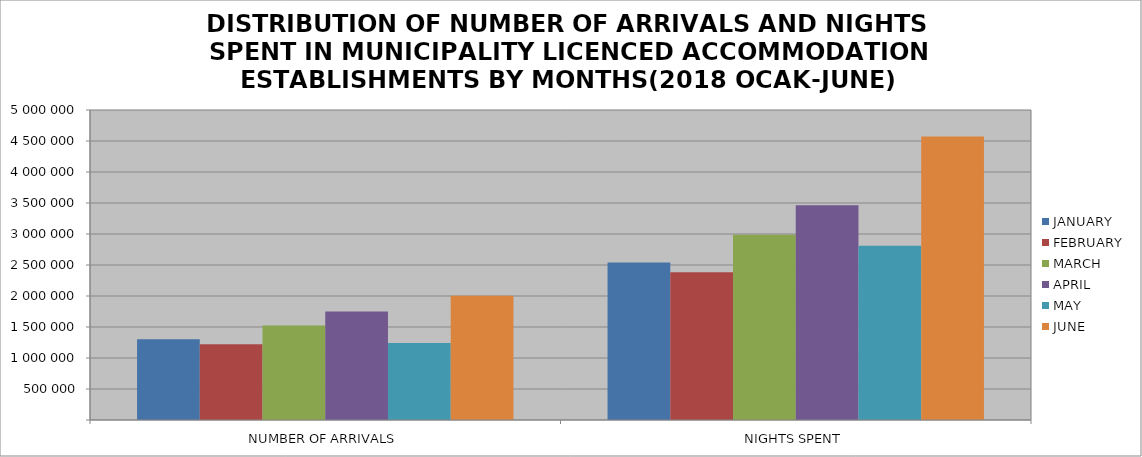
| Category | JANUARY | FEBRUARY | MARCH | APRIL | MAY | JUNE |
|---|---|---|---|---|---|---|
| NUMBER OF ARRIVALS | 1303353 | 1223475 | 1526172 | 1749085 | 1240889 | 2003881 |
| NIGHTS SPENT | 2542103 | 2381300 | 2986820 | 3463261 | 2810808 | 4572629 |